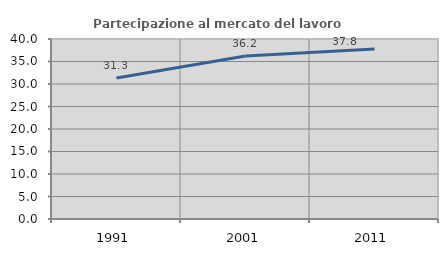
| Category | Partecipazione al mercato del lavoro  femminile |
|---|---|
| 1991.0 | 31.334 |
| 2001.0 | 36.223 |
| 2011.0 | 37.781 |